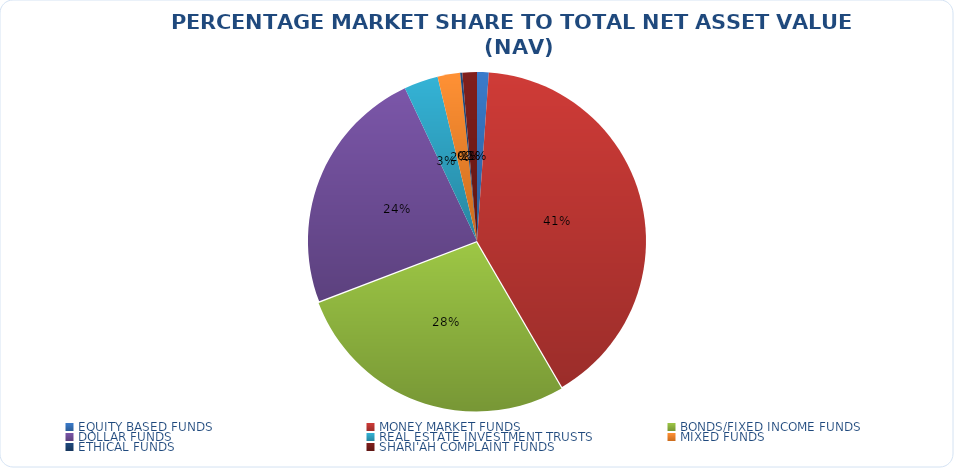
| Category | NET ASSET VALUE |
|---|---|
| EQUITY BASED FUNDS | 15674117794.778 |
| MONEY MARKET FUNDS | 567896466007.218 |
| BONDS/FIXED INCOME FUNDS | 386910649743.88 |
| DOLLAR FUNDS | 333853535702.379 |
| REAL ESTATE INVESTMENT TRUSTS | 45775630302.32 |
| MIXED FUNDS | 30236302038.614 |
| ETHICAL FUNDS | 2898104930.26 |
| SHARI'AH COMPLAINT FUNDS | 19464545301.92 |